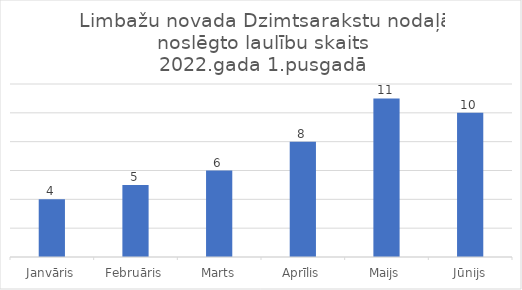
| Category | Series 0 |
|---|---|
| Janvāris | 4 |
| Februāris | 5 |
| Marts | 6 |
| Aprīlis | 8 |
| Maijs | 11 |
| Jūnijs | 10 |